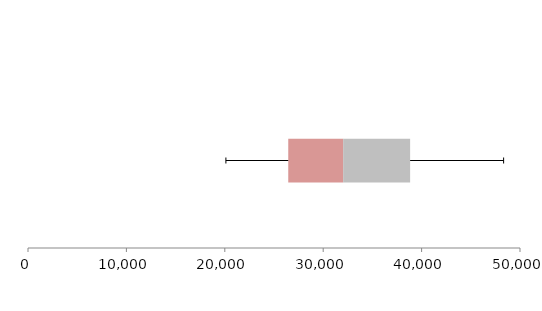
| Category | Series 1 | Series 2 | Series 3 |
|---|---|---|---|
| 0 | 26448.728 | 5580.413 | 6804.387 |